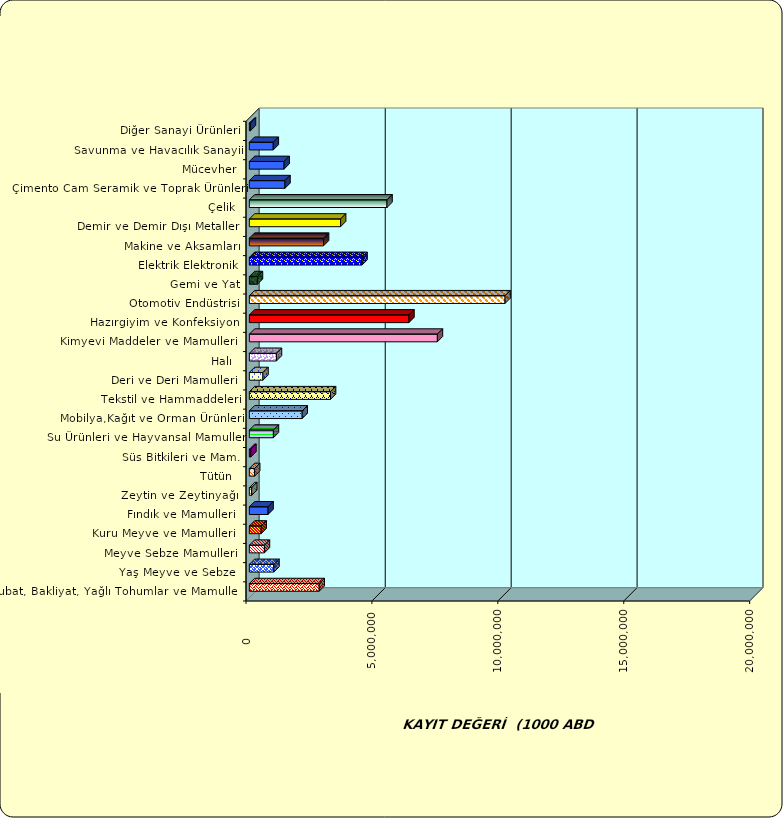
| Category | Series 0 |
|---|---|
|  Hububat, Bakliyat, Yağlı Tohumlar ve Mamulleri  | 2773211.398 |
|  Yaş Meyve ve Sebze   | 976298.455 |
|  Meyve Sebze Mamulleri  | 597929.864 |
|  Kuru Meyve ve Mamulleri   | 468888.343 |
|  Fındık ve Mamulleri  | 742827.033 |
|  Zeytin ve Zeytinyağı  | 93675.47 |
|  Tütün  | 210519.729 |
|  Süs Bitkileri ve Mam. | 61030.899 |
|  Su Ürünleri ve Hayvansal Mamuller | 955429.319 |
|  Mobilya,Kağıt ve Orman Ürünleri | 2098243.828 |
|  Tekstil ve Hammaddeleri | 3223328.872 |
|  Deri ve Deri Mamulleri  | 540040.76 |
|  Halı  | 1075046.577 |
|  Kimyevi Maddeler ve Mamulleri   | 7466783.542 |
|  Hazırgiyim ve Konfeksiyon  | 6336206.575 |
|  Otomotiv Endüstrisi | 10153350.218 |
|  Gemi ve Yat | 320991.746 |
|  Elektrik Elektronik | 4474737.871 |
|  Makine ve Aksamları | 2945068.966 |
|  Demir ve Demir Dışı Metaller  | 3622966.962 |
|  Çelik | 5465857.351 |
|  Çimento Cam Seramik ve Toprak Ürünleri | 1413999.907 |
|  Mücevher | 1380148.283 |
|  Savunma ve Havacılık Sanayii | 949743.91 |
|  Diğer Sanayi Ürünleri | 43071.542 |